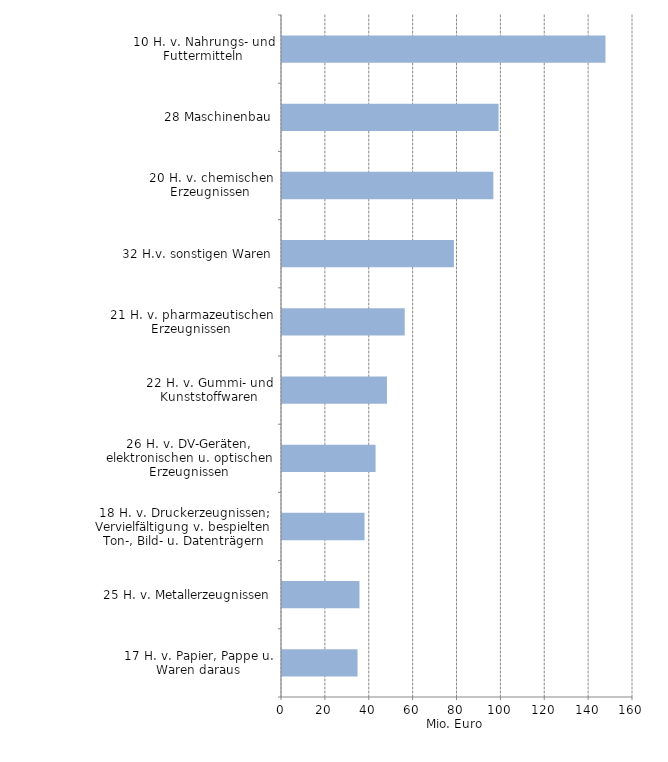
| Category | Mio. Euro |
|---|---|
| 17 H. v. Papier, Pappe u. Waren daraus | 34.439 |
| 25 H. v. Metallerzeugnissen | 35.316 |
| 18 H. v. Druckerzeugnissen; Vervielfältigung v. bespielten Ton-, Bild- u. Datenträgern | 37.623 |
| 26 H. v. DV-Geräten, elektronischen u. optischen Erzeugnissen | 42.665 |
| 22 H. v. Gummi- und Kunststoffwaren | 47.861 |
| 21 H. v. pharmazeutischen Erzeugnissen | 55.947 |
| 32 H.v. sonstigen Waren | 78.362 |
| 20 H. v. chemischen Erzeugnissen | 96.331 |
| 28 Maschinenbau | 98.723 |
| 10 H. v. Nahrungs- und Futtermitteln | 147.45 |